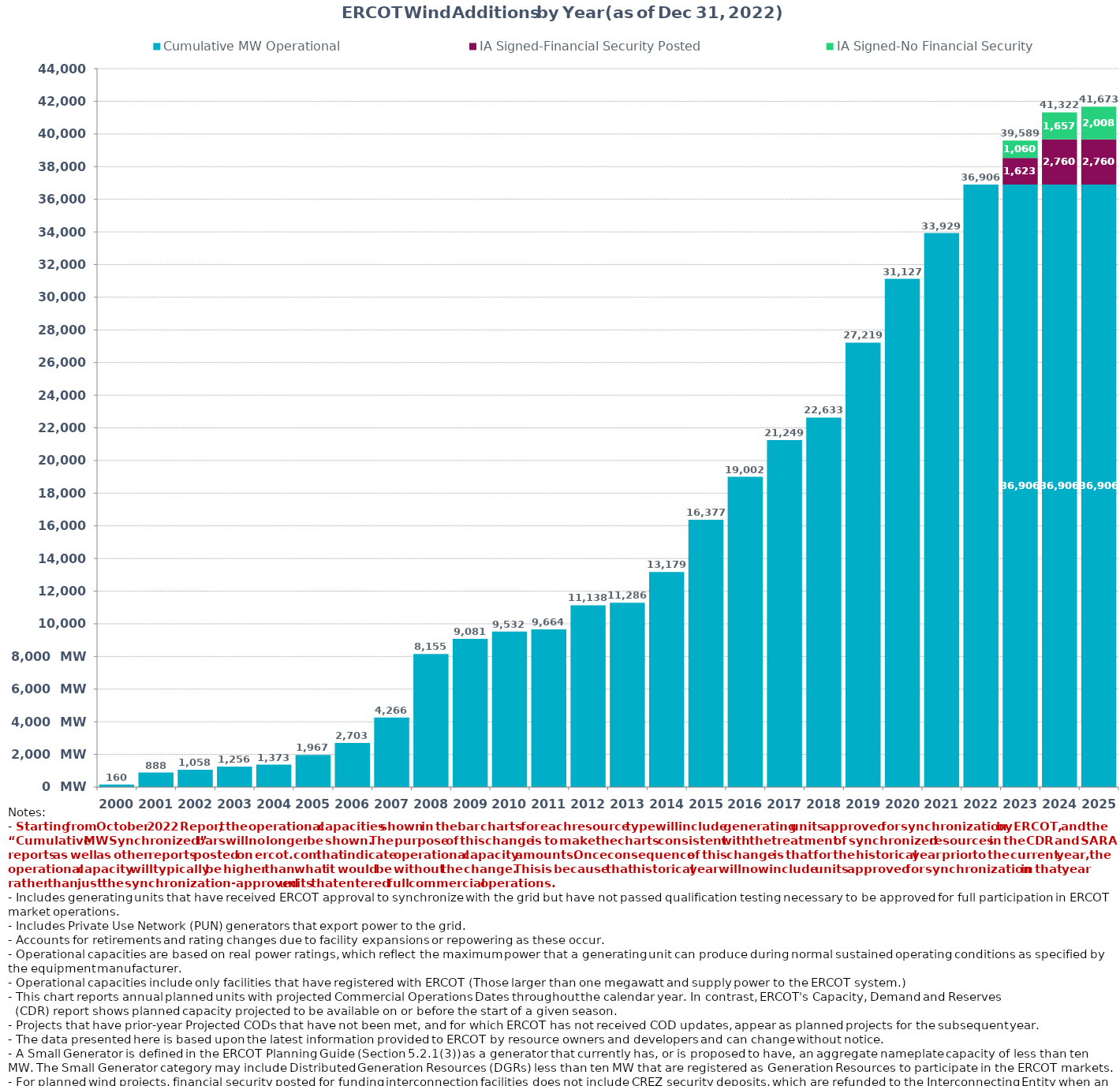
| Category | Cumulative MW Operational  | IA Signed-Financial Security Posted  | IA Signed-No Financial Security  | Other Planned | Cumulative Installed and Planned |
|---|---|---|---|---|---|
| 2000.0 | 160.37 | 0 | 0 | 0 | 160.37 |
| 2001.0 | 887.97 | 0 | 0 | 0 | 887.97 |
| 2002.0 | 1058.22 | 0 | 0 | 0 | 1058.22 |
| 2003.0 | 1255.72 | 0 | 0 | 0 | 1255.72 |
| 2004.0 | 1372.82 | 0 | 0 | 0 | 1372.82 |
| 2005.0 | 1967.04 | 0 | 0 | 0 | 1967.04 |
| 2006.0 | 2703.34 | 0 | 0 | 0 | 2703.34 |
| 2007.0 | 4266.36 | 0 | 0 | 0 | 4266.36 |
| 2008.0 | 8154.76 | 0 | 0 | 0 | 8154.76 |
| 2009.0 | 9080.78 | 0 | 0 | 0 | 9080.78 |
| 2010.0 | 9531.7 | 0 | 0 | 0 | 9531.7 |
| 2011.0 | 9663.7 | 0 | 0 | 0 | 9663.7 |
| 2012.0 | 11137.66 | 0 | 0 | 0 | 11137.66 |
| 2013.0 | 11286.26 | 0 | 0 | 0 | 11286.26 |
| 2014.0 | 13178.84 | 0 | 0 | 0 | 13178.84 |
| 2015.0 | 16376.53 | 0 | 0 | 0 | 16376.53 |
| 2016.0 | 19001.85 | 0 | 0 | 0 | 19001.85 |
| 2017.0 | 21248.99 | 0 | 0 | 0 | 21248.99 |
| 2018.0 | 22632.69 | 0 | 0 | 0 | 22632.69 |
| 2019.0 | 27219.34 | 0 | 0 | 0 | 27219.34 |
| 2020.0 | 31127.31 | 0 | 0 | 0 | 31127.31 |
| 2021.0 | 33928.91 | 0 | 0 | 0 | 33928.91 |
| 2022.0 | 36906.07 | 0 | 0 | 0 | 36906.07 |
| 2023.0 | 36906.07 | 1623.46 | 1059.7 | 0 | 39589.23 |
| 2024.0 | 36906.07 | 2759.56 | 1656.71 | 0 | 41322.34 |
| 2025.0 | 36906.07 | 2759.56 | 2007.71 | 0 | 41673.34 |